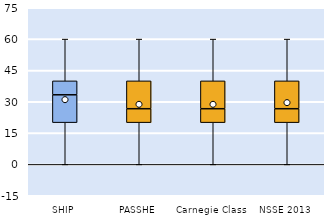
| Category | 25th | 50th | 75th |
|---|---|---|---|
| SHIP | 20 | 13.333 | 6.667 |
| PASSHE | 20 | 6.667 | 13.333 |
| Carnegie Class | 20 | 6.667 | 13.333 |
| NSSE 2013 | 20 | 6.667 | 13.333 |